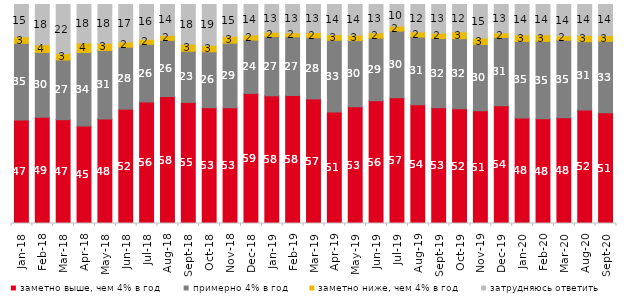
| Category | заметно выше, чем 4% в год | примерно 4% в год | заметно ниже, чем 4% в год | затрудняюсь ответить |
|---|---|---|---|---|
| 2018-01-01 | 47.25 | 35 | 3 | 14.75 |
| 2018-02-01 | 48.5 | 29.6 | 3.5 | 18.4 |
| 2018-03-01 | 47.4 | 27.25 | 2.9 | 22.45 |
| 2018-04-01 | 44.55 | 33.55 | 4.3 | 17.6 |
| 2018-05-01 | 47.7 | 31.3 | 3.25 | 17.75 |
| 2018-06-01 | 52.2 | 28.3 | 2.4 | 17.1 |
| 2018-07-01 | 55.5 | 26.35 | 2.25 | 15.9 |
| 2018-08-01 | 57.95 | 25.65 | 2.3 | 14.1 |
| 2018-09-01 | 55.3 | 23.35 | 3.25 | 18.1 |
| 2018-10-01 | 52.85 | 25.55 | 2.95 | 18.65 |
| 2018-11-01 | 52.844 | 29.491 | 3.144 | 14.521 |
| 2018-12-01 | 59.4 | 24.35 | 2.35 | 13.9 |
| 2019-01-01 | 58.3 | 27.05 | 2 | 12.65 |
| 2019-02-01 | 58.45 | 26.8 | 1.85 | 12.9 |
| 2019-03-01 | 56.887 | 27.946 | 2.387 | 12.78 |
| 2019-04-01 | 50.891 | 32.772 | 2.574 | 13.762 |
| 2019-05-01 | 53.343 | 30.163 | 2.526 | 13.967 |
| 2019-06-01 | 56.06 | 28.579 | 2.444 | 12.918 |
| 2019-07-01 | 57.475 | 30.396 | 2.228 | 9.901 |
| 2019-08-01 | 54.246 | 30.869 | 2.398 | 12.488 |
| 2019-09-01 | 52.822 | 31.634 | 2.475 | 13.069 |
| 2019-10-01 | 52.426 | 31.98 | 3.119 | 12.475 |
| 2019-11-01 | 51.485 | 30.297 | 2.921 | 15.297 |
| 2019-12-01 | 53.713 | 31.238 | 2.079 | 12.97 |
| 2020-01-01 | 48.119 | 35 | 3.02 | 13.861 |
| 2020-02-01 | 47.822 | 35.347 | 2.97 | 13.861 |
| 2020-03-01 | 48.24 | 35.449 | 2.033 | 14.279 |
| 2020-08-01 | 51.787 | 31.231 | 2.88 | 14.101 |
| 2020-09-01 | 50.523 | 32.653 | 2.688 | 14.136 |